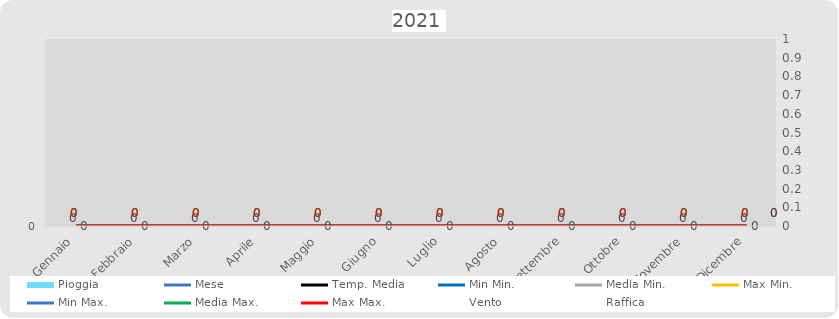
| Category | Pioggia |
|---|---|
| 0 | 0 |
| 1 | 0 |
| 2 | 0 |
| 3 | 0 |
| 4 | 0 |
| 5 | 0 |
| 6 | 0 |
| 7 | 0 |
| 8 | 0 |
| 9 | 0 |
| 10 | 0 |
| 11 | 0 |